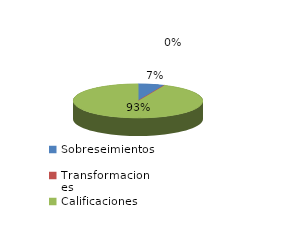
| Category | Series 0 |
|---|---|
| Sobreseimientos | 15 |
| Transformaciones | 0 |
| Calificaciones | 212 |